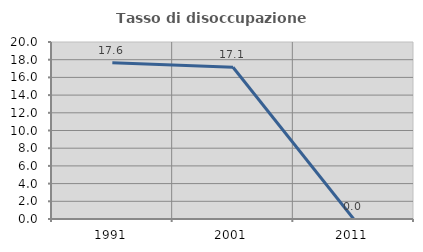
| Category | Tasso di disoccupazione giovanile  |
|---|---|
| 1991.0 | 17.647 |
| 2001.0 | 17.143 |
| 2011.0 | 0 |